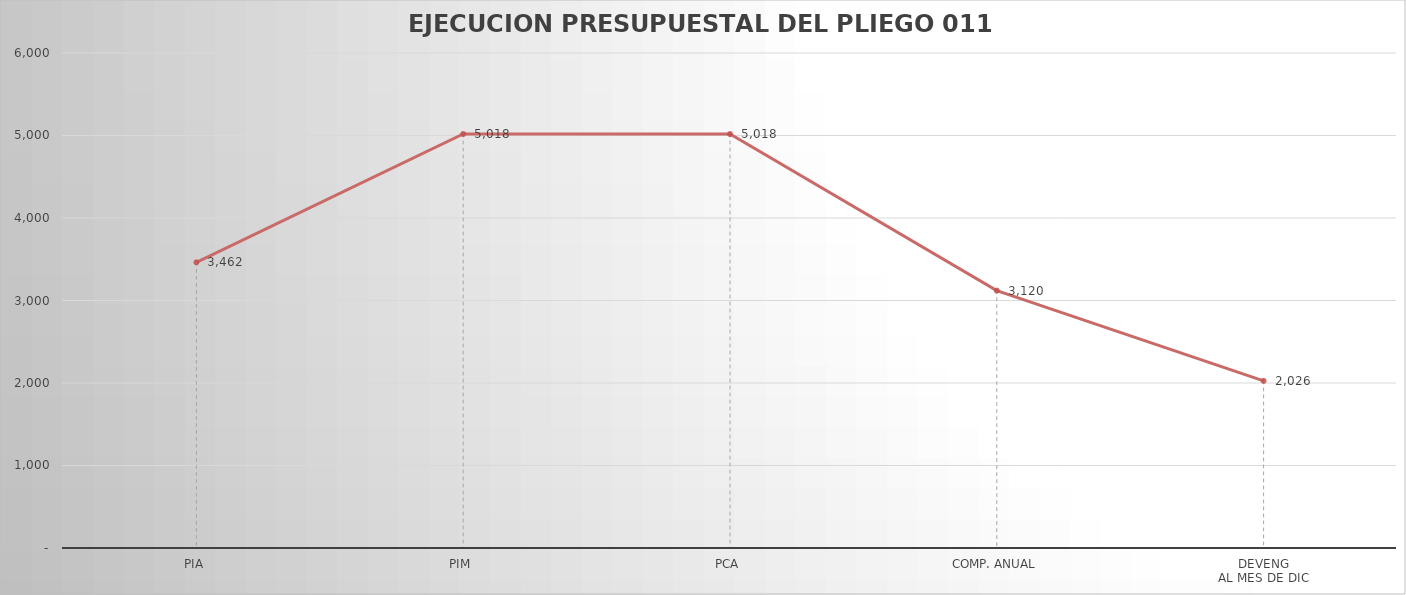
| Category | Series 0 |
|---|---|
| PIA | 3462.391 |
| PIM | 5018.103 |
| PCA | 5018.103 |
| COMP. ANUAL | 3120.008 |
| DEVENG
AL MES DE DIC | 2025.582 |